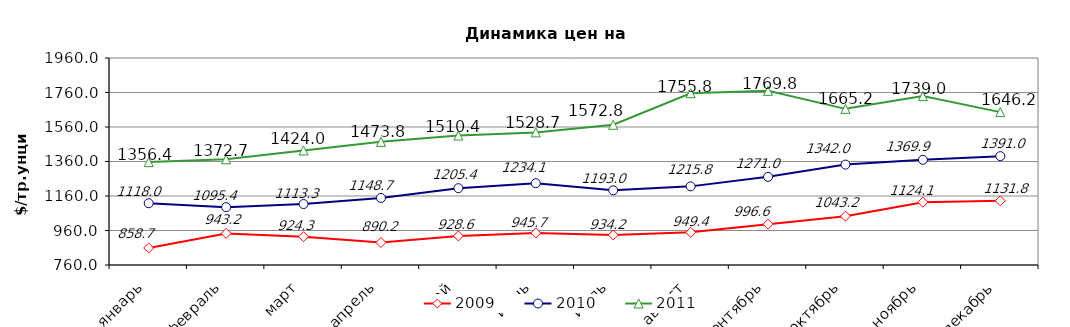
| Category | 2009 | 2010 | 2011 |
|---|---|---|---|
| январь | 858.69 | 1117.962 | 1356.4 |
| февраль | 943.162 | 1095.412 | 1372.73 |
| март | 924.273 | 1113.34 | 1424.01 |
| апрель | 890.2 | 1148.69 | 1473.81 |
| май | 928.645 | 1205.43 | 1510.44 |
| июнь | 945.67 | 1234.075 | 1528.66 |
| июль | 934.228 | 1192.97 | 1572.81 |
| август | 949.38 | 1215.81 | 1755.81 |
| сентябрь | 996.589 | 1270.98 | 1769.76 |
| октябрь | 1043.159 | 1342 | 1665.214 |
| ноябрь | 1124.06 | 1369.89 | 1738.98 |
| декабрь | 1131.821 | 1391.01 | 1646.18 |